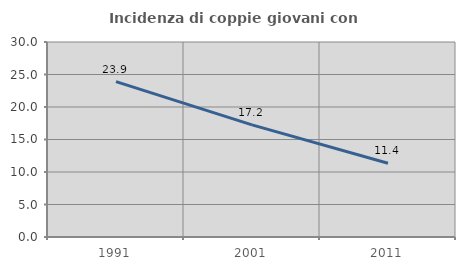
| Category | Incidenza di coppie giovani con figli |
|---|---|
| 1991.0 | 23.901 |
| 2001.0 | 17.245 |
| 2011.0 | 11.352 |